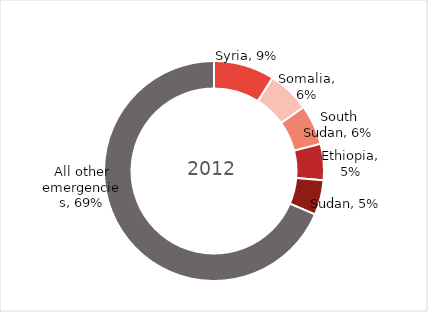
| Category | % of total |
|---|---|
| Syria | 0.089 |
| Somalia | 0.062 |
| South Sudan | 0.059 |
| Ethiopia | 0.053 |
| Sudan | 0.051 |
| All other emergencies | 0.685 |